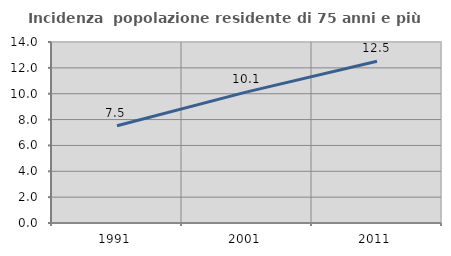
| Category | Incidenza  popolazione residente di 75 anni e più |
|---|---|
| 1991.0 | 7.52 |
| 2001.0 | 10.143 |
| 2011.0 | 12.513 |